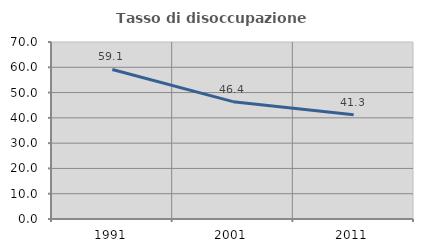
| Category | Tasso di disoccupazione giovanile  |
|---|---|
| 1991.0 | 59.141 |
| 2001.0 | 46.411 |
| 2011.0 | 41.268 |